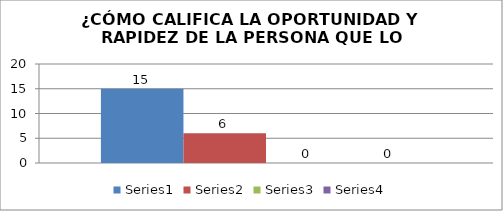
| Category | Series 0 | Series 1 | Series 2 | Series 3 |
|---|---|---|---|---|
| 0 | 15 | 6 | 0 | 0 |